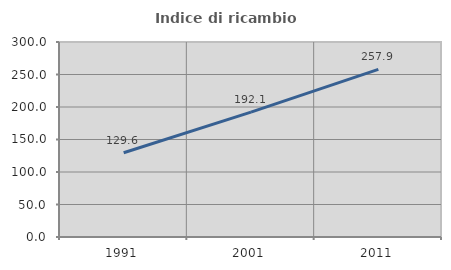
| Category | Indice di ricambio occupazionale  |
|---|---|
| 1991.0 | 129.598 |
| 2001.0 | 192.074 |
| 2011.0 | 257.938 |